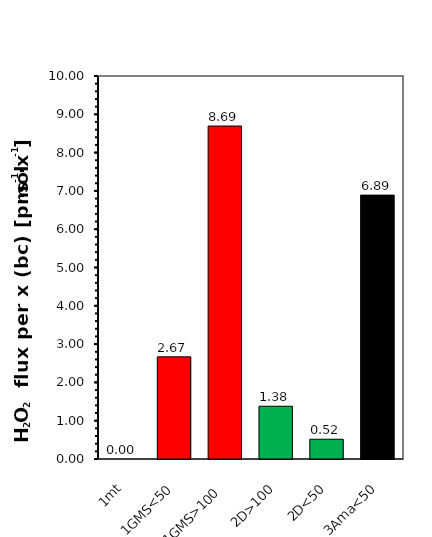
| Category | J°1 |
|---|---|
| 1mt | 0 |
| 1GMS<50 | 2.667 |
| 1GMS>100 | 8.693 |
| 2D>100 | 1.378 |
| 2D<50 | 0.516 |
| 3Ama<50 | 6.89 |